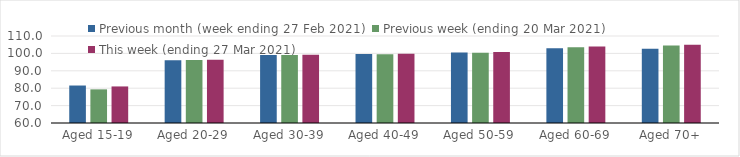
| Category | Previous month (week ending 27 Feb 2021) | Previous week (ending 20 Mar 2021) | This week (ending 27 Mar 2021) |
|---|---|---|---|
| Aged 15-19 | 81.54 | 79.33 | 81.01 |
| Aged 20-29 | 96.03 | 96.22 | 96.38 |
| Aged 30-39 | 99.1 | 99.03 | 99.17 |
| Aged 40-49 | 99.67 | 99.53 | 99.81 |
| Aged 50-59 | 100.55 | 100.42 | 100.84 |
| Aged 60-69 | 102.89 | 103.54 | 103.99 |
| Aged 70+ | 102.7 | 104.6 | 104.95 |